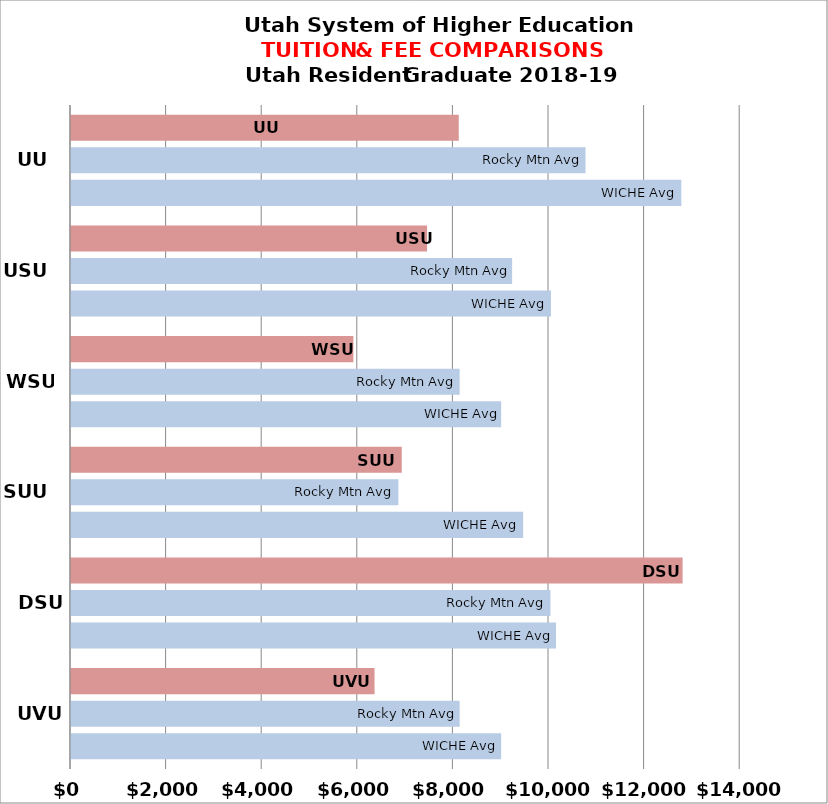
| Category | WICHE Avg | Rocky Mtn Avg | USHE Inst |
|---|---|---|---|
| UVU | 8999.4 | 8130.667 | 6350 |
| DSU | 10146.929 | 10029.857 | 12795 |
| SUU | 9459.4 | 6849 | 6920 |
| WSU | 8999.4 | 8130.667 | 5907 |
| USU | 10041.4 | 9228.556 | 7449 |
| UU | 12768.619 | 10763.625 | 8112 |